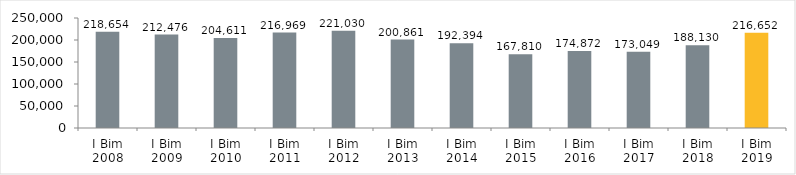
| Category | Series 0 |
|---|---|
| I Bim 2008 | 218654 |
| I Bim 2009 | 212476 |
| I Bim 2010 | 204611 |
| I Bim 2011 | 216969 |
| I Bim 2012 | 221030 |
| I Bim 2013 | 200861 |
| I Bim 2014 | 192394 |
| I Bim 2015 | 167810 |
| I Bim 2016 | 174872 |
| I Bim 2017 | 173049 |
| I Bim 2018 | 188130 |
| I Bim 2019 | 216652 |